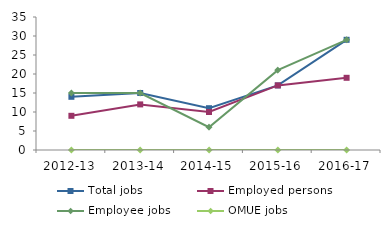
| Category | Total jobs | Employed persons | Employee jobs | OMUE jobs |
|---|---|---|---|---|
| 2012-13 | 14 | 9 | 15 | 0 |
| 2013-14 | 15 | 12 | 15 | 0 |
| 2014-15 | 11 | 10 | 6 | 0 |
| 2015-16 | 17 | 17 | 21 | 0 |
| 2016-17 | 29 | 19 | 29 | 0 |